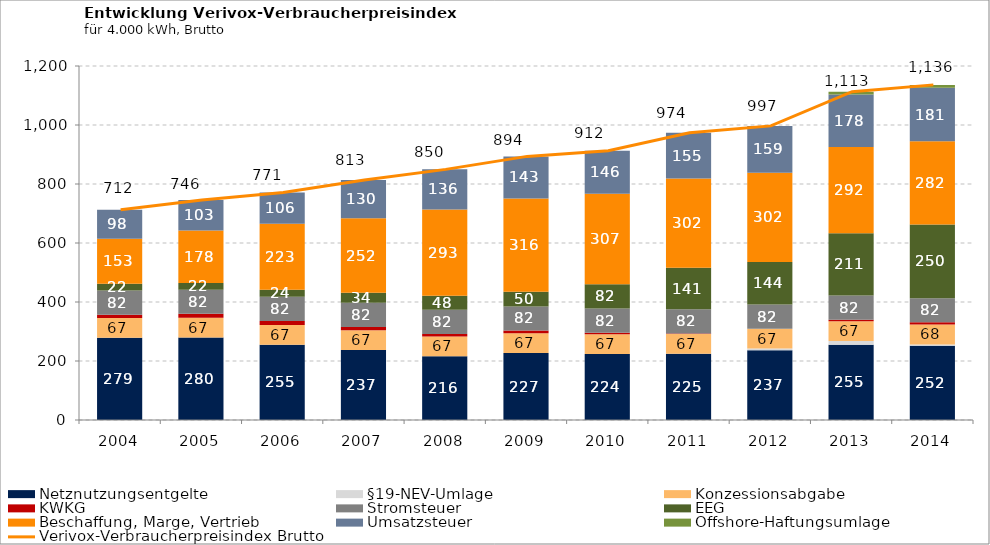
| Category | Netznutzungsentgelte | §19-NEV-Umlage | Konzessionsabgabe | KWKG | Stromsteuer | EEG | Beschaffung, Marge, Vertrieb | Umsatzsteuer | Offshore-Haftungsumlage |
|---|---|---|---|---|---|---|---|---|---|
| 2004.0 | 278.811 | 0 | 67 | 11.36 | 82 | 22.4 | 152.593 | 98.266 | 0 |
| 2005.0 | 279.503 | 0 | 67 | 13.44 | 82 | 22.4 | 178.419 | 102.842 | 0 |
| 2006.0 | 255.218 | 0 | 67 | 13.64 | 82 | 24 | 223.01 | 106.379 | 0 |
| 2007.0 | 236.977 | 0 | 67 | 11.56 | 82 | 33.6 | 252.394 | 129.871 | 0 |
| 2008.0 | 216.363 | 0 | 67 | 7.96 | 82 | 48 | 292.626 | 135.65 | 0 |
| 2009.0 | 226.83 | 0 | 67 | 9.24 | 82 | 50 | 315.843 | 142.673 | 0 |
| 2010.0 | 223.666 | 0 | 67 | 5.2 | 82 | 81.88 | 307.036 | 145.689 | 0 |
| 2011.0 | 224.849 | 0 | 67 | 1.2 | 82 | 141.2 | 301.972 | 155.462 | 0 |
| 2012.0 | 236.533 | 6.04 | 67 | 0.08 | 82 | 143.68 | 302.482 | 159.185 | 0 |
| 2013.0 | 255 | 13 | 67 | 5 | 82 | 211 | 292.294 | 177.706 | 10 |
| 2014.0 | 252 | 4 | 68 | 7 | 82 | 250 | 281.622 | 181.378 | 10 |